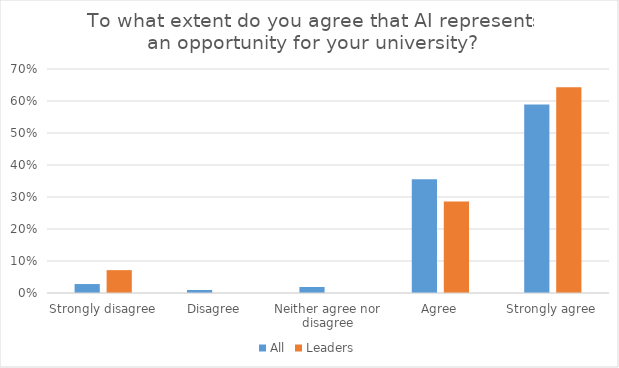
| Category | All | Leaders |
|---|---|---|
| Strongly disagree | 0.028 | 0.071 |
| Disagree | 0.009 | 0 |
| Neither agree nor disagree | 0.019 | 0 |
| Agree | 0.355 | 0.286 |
| Strongly agree | 0.589 | 0.643 |